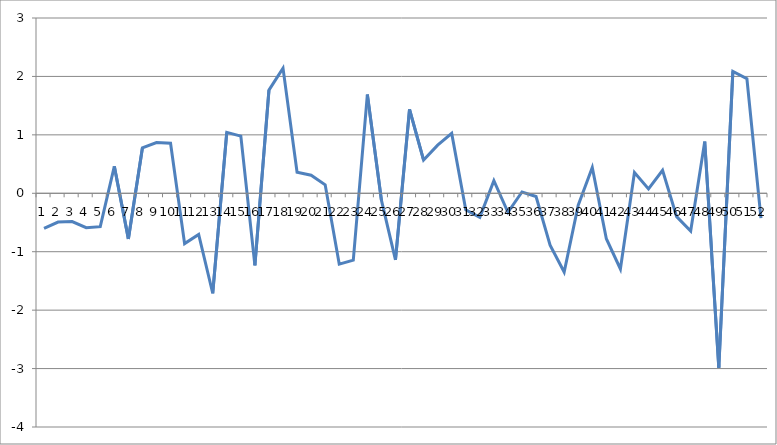
| Category | Series 0 |
|---|---|
| 0 | -0.602 |
| 1 | -0.492 |
| 2 | -0.485 |
| 3 | -0.588 |
| 4 | -0.571 |
| 5 | 0.462 |
| 6 | -0.781 |
| 7 | 0.778 |
| 8 | 0.868 |
| 9 | 0.856 |
| 10 | -0.862 |
| 11 | -0.705 |
| 12 | -1.711 |
| 13 | 1.042 |
| 14 | 0.979 |
| 15 | -1.235 |
| 16 | 1.766 |
| 17 | 2.142 |
| 18 | 0.36 |
| 19 | 0.309 |
| 20 | 0.145 |
| 21 | -1.212 |
| 22 | -1.144 |
| 23 | 1.69 |
| 24 | -0.118 |
| 25 | -1.141 |
| 26 | 1.436 |
| 27 | 0.569 |
| 28 | 0.823 |
| 29 | 1.025 |
| 30 | -0.282 |
| 31 | -0.412 |
| 32 | 0.215 |
| 33 | -0.326 |
| 34 | 0.022 |
| 35 | -0.055 |
| 36 | -0.887 |
| 37 | -1.348 |
| 38 | -0.204 |
| 39 | 0.442 |
| 40 | -0.778 |
| 41 | -1.295 |
| 42 | 0.357 |
| 43 | 0.075 |
| 44 | 0.394 |
| 45 | -0.4 |
| 46 | -0.645 |
| 47 | 0.885 |
| 48 | -2.986 |
| 49 | 2.086 |
| 50 | 1.96 |
| 51 | -0.425 |